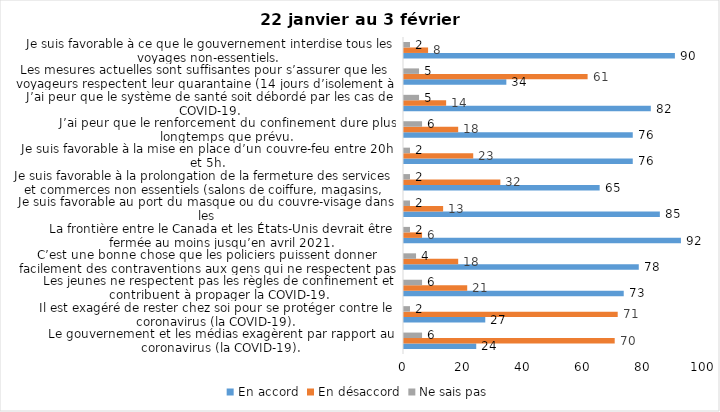
| Category | En accord | En désaccord | Ne sais pas |
|---|---|---|---|
| Le gouvernement et les médias exagèrent par rapport au coronavirus (la COVID-19). | 24 | 70 | 6 |
| Il est exagéré de rester chez soi pour se protéger contre le coronavirus (la COVID-19). | 27 | 71 | 2 |
| Les jeunes ne respectent pas les règles de confinement et contribuent à propager la COVID-19. | 73 | 21 | 6 |
| C’est une bonne chose que les policiers puissent donner facilement des contraventions aux gens qui ne respectent pas les mesures pour prévenir le coronavirus (la COVID-19). | 78 | 18 | 4 |
| La frontière entre le Canada et les États-Unis devrait être fermée au moins jusqu’en avril 2021. | 92 | 6 | 2 |
| Je suis favorable au port du masque ou du couvre-visage dans les
lieux publics extérieurs achalandés (ex. rues, parcs) | 85 | 13 | 2 |
| Je suis favorable à la prolongation de la fermeture des services et commerces non essentiels (salons de coiffure, magasins, industries) jusqu’au 8 février. | 65 | 32 | 2 |
| Je suis favorable à la mise en place d’un couvre-feu entre 20h et 5h. | 76 | 23 | 2 |
| J’ai peur que le renforcement du confinement dure plus longtemps que prévu. | 76 | 18 | 6 |
| J’ai peur que le système de santé soit débordé par les cas de COVID-19. | 82 | 14 | 5 |
| Les mesures actuelles sont suffisantes pour s’assurer que les voyageurs respectent leur quarantaine (14 jours d’isolement à la maison au retour d’un voyage). | 34 | 61 | 5 |
| Je suis favorable à ce que le gouvernement interdise tous les voyages non-essentiels. | 90 | 8 | 2 |